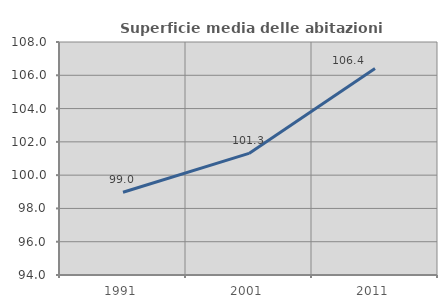
| Category | Superficie media delle abitazioni occupate |
|---|---|
| 1991.0 | 98.973 |
| 2001.0 | 101.306 |
| 2011.0 | 106.409 |